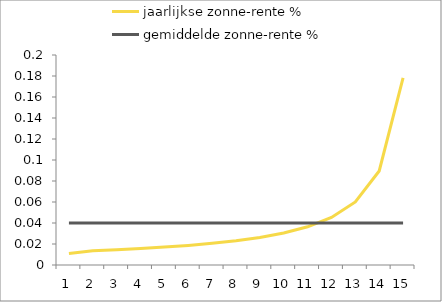
| Category | Series 3 |  jaarlijkse zonne-rente % |  gemiddelde zonne-rente % |
|---|---|---|---|
| 0 | 0 |  |  |
| 1 | 0 |  |  |
| 2 | 0 |  |  |
| 3 | 0 |  |  |
| 4 | 0 |  |  |
| 5 | 0 |  |  |
| 6 | 0 |  |  |
| 7 | 0 |  |  |
| 8 | 0 |  |  |
| 9 | 0 |  |  |